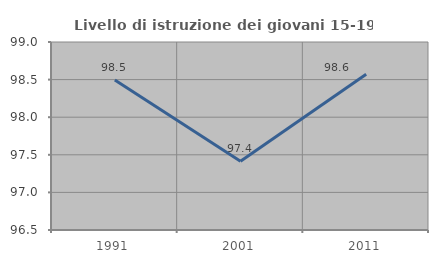
| Category | Livello di istruzione dei giovani 15-19 anni |
|---|---|
| 1991.0 | 98.495 |
| 2001.0 | 97.414 |
| 2011.0 | 98.571 |